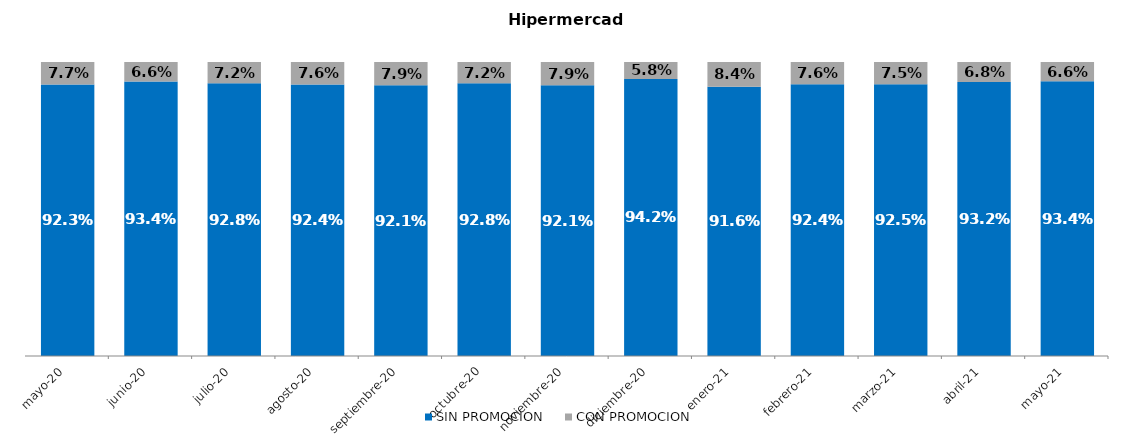
| Category | SIN PROMOCION   | CON PROMOCION   |
|---|---|---|
| 2020-05-01 | 0.923 | 0.077 |
| 2020-06-01 | 0.934 | 0.066 |
| 2020-07-01 | 0.928 | 0.072 |
| 2020-08-01 | 0.924 | 0.076 |
| 2020-09-01 | 0.921 | 0.079 |
| 2020-10-01 | 0.928 | 0.072 |
| 2020-11-01 | 0.921 | 0.079 |
| 2020-12-01 | 0.942 | 0.058 |
| 2021-01-01 | 0.916 | 0.084 |
| 2021-02-01 | 0.924 | 0.076 |
| 2021-03-01 | 0.925 | 0.075 |
| 2021-04-01 | 0.932 | 0.068 |
| 2021-05-01 | 0.934 | 0.066 |